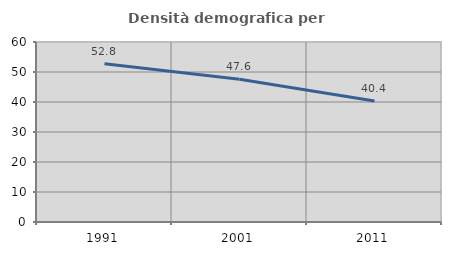
| Category | Densità demografica |
|---|---|
| 1991.0 | 52.751 |
| 2001.0 | 47.567 |
| 2011.0 | 40.365 |